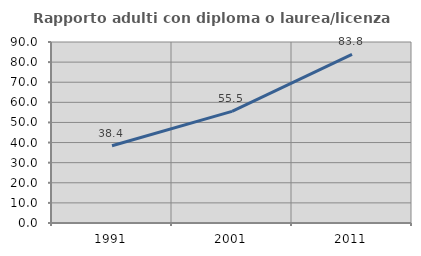
| Category | Rapporto adulti con diploma o laurea/licenza media  |
|---|---|
| 1991.0 | 38.418 |
| 2001.0 | 55.513 |
| 2011.0 | 83.824 |